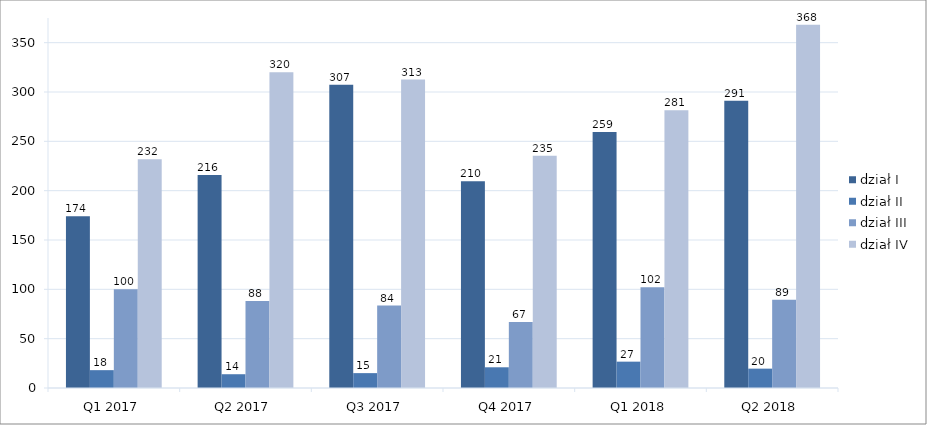
| Category |  dział I  |  dział II  |  dział III  |  dział IV  |
|---|---|---|---|---|
|  Q1 2017  | 174061 | 18086 | 100022 | 231871 |
|  Q2 2017  | 215929 | 13965 | 88263 | 320090 |
|  Q3 2017  | 307370 | 15076 | 83574 | 312574 |
|  Q4 2017  | 209618 | 20996 | 66859 | 235476 |
|  Q1 2018  | 259498 | 26704 | 102206 | 281424 |
|  Q2 2018  | 291188 | 19621 | 89432 | 368071 |